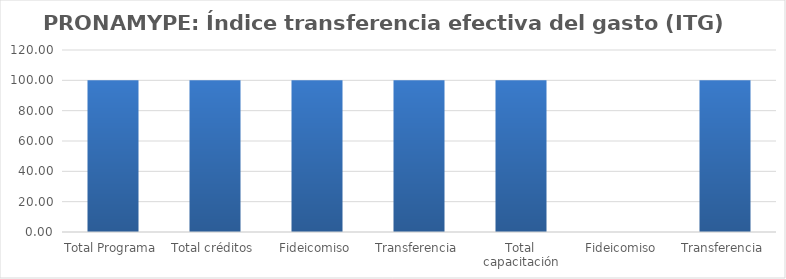
| Category | Índice transferencia efectiva del gasto (ITG) |
|---|---|
| Total Programa | 100 |
| Total créditos | 100 |
| Fideicomiso | 100 |
| Transferencia | 100 |
| Total capacitación | 100 |
| Fideicomiso | 0 |
| Transferencia | 100 |